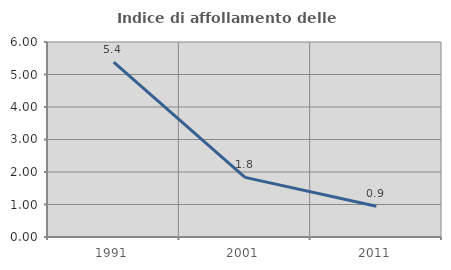
| Category | Indice di affollamento delle abitazioni  |
|---|---|
| 1991.0 | 5.383 |
| 2001.0 | 1.834 |
| 2011.0 | 0.943 |